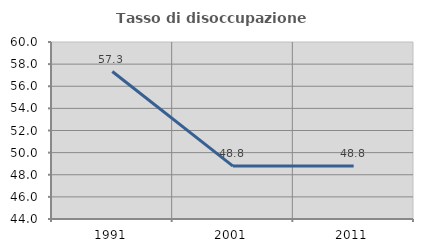
| Category | Tasso di disoccupazione giovanile  |
|---|---|
| 1991.0 | 57.333 |
| 2001.0 | 48.78 |
| 2011.0 | 48.78 |